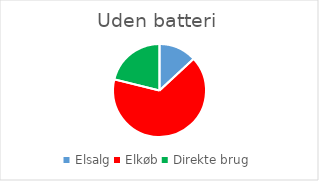
| Category | Series 0 |
|---|---|
| Elsalg | 1205.378 |
| Elkøb | 6053.175 |
| Direkte brug | 1946.825 |